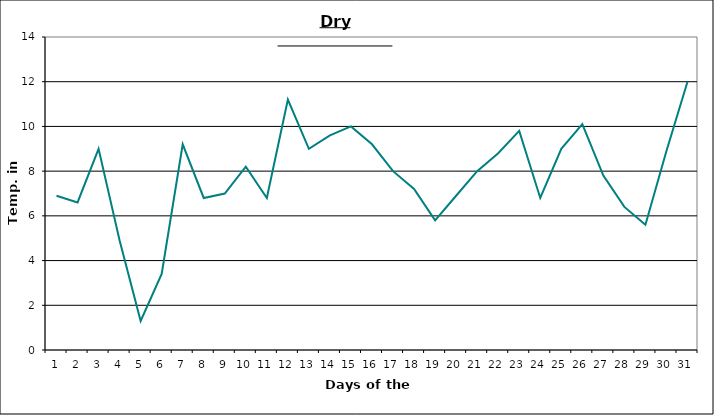
| Category | Series 0 |
|---|---|
| 0 | 6.9 |
| 1 | 6.6 |
| 2 | 9 |
| 3 | 4.9 |
| 4 | 1.3 |
| 5 | 3.4 |
| 6 | 9.2 |
| 7 | 6.8 |
| 8 | 7 |
| 9 | 8.2 |
| 10 | 6.8 |
| 11 | 11.2 |
| 12 | 9 |
| 13 | 9.6 |
| 14 | 10 |
| 15 | 9.2 |
| 16 | 8 |
| 17 | 7.2 |
| 18 | 5.8 |
| 19 | 6.9 |
| 20 | 8 |
| 21 | 8.8 |
| 22 | 9.8 |
| 23 | 6.8 |
| 24 | 9 |
| 25 | 10.1 |
| 26 | 7.8 |
| 27 | 6.4 |
| 28 | 5.6 |
| 29 | 8.9 |
| 30 | 12 |